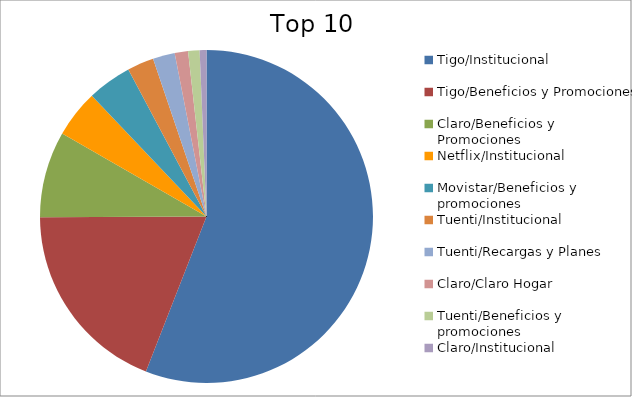
| Category | Series 0 |
|---|---|
| Tigo/Institucional | 55.29 |
| Tigo/Beneficios y Promociones | 18.78 |
| Claro/Beneficios y Promociones | 8.29 |
| Netflix/Institucional | 4.55 |
| Movistar/Beneficios y promociones | 4.26 |
| Tuenti/Institucional | 2.55 |
| Tuenti/Recargas y Planes | 2.11 |
| Claro/Claro Hogar | 1.28 |
| Tuenti/Beneficios y promociones | 1.1 |
| Claro/Institucional | 0.65 |